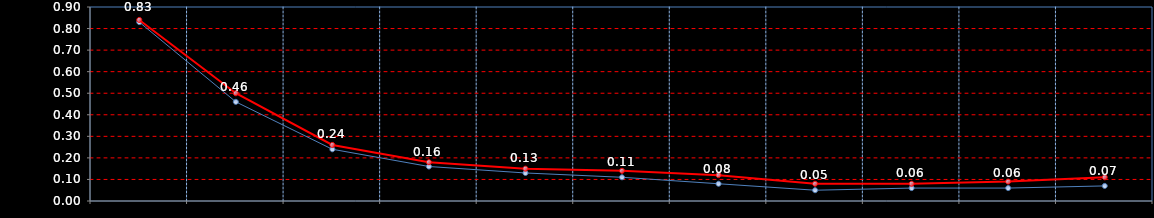
| Category | Last | Settlement |
|---|---|---|
| AUG, SEP | 0.83 | 0.84 |
| SEP, OCT | 0.46 | 0.5 |
| OCT, NOV | 0.24 | 0.26 |
| NOV, DEC | 0.16 | 0.18 |
| DEC, JAN | 0.13 | 0.15 |
| JAN, FEB | 0.11 | 0.14 |
| FEB, MAR | 0.08 | 0.12 |
| MAR, APR | 0.05 | 0.08 |
| APR, MAY | 0.06 | 0.08 |
| MAY, JUN | 0.06 | 0.09 |
| JUN, JUL | 0.07 | 0.11 |